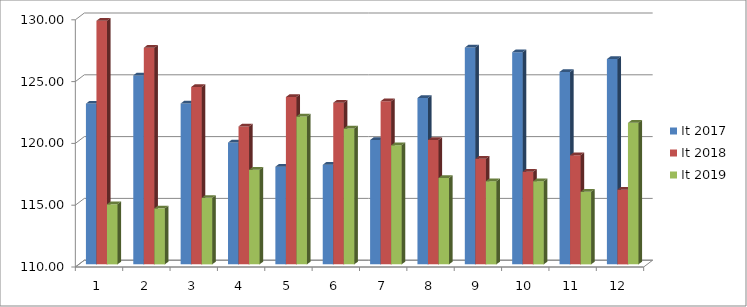
| Category | It 2017 | It 2018 | It 2019 |
|---|---|---|---|
| 0 | 123.006 | 129.71 | 114.86 |
| 1 | 125.289 | 127.53 | 114.53 |
| 2 | 123.015 | 124.35 | 115.38 |
| 3 | 119.856 | 121.16 | 117.65 |
| 4 | 117.903 | 123.54 | 121.97 |
| 5 | 118.059 | 123.08 | 120.99 |
| 6 | 120.062 | 123.2 | 119.63 |
| 7 | 123.459 | 120.07 | 116.99 |
| 8 | 127.544 | 118.54 | 116.73 |
| 9 | 127.168 | 117.5 | 116.73 |
| 10 | 125.572 | 118.83 | 115.87 |
| 11 | 126.61 | 116.04 | 121.45 |